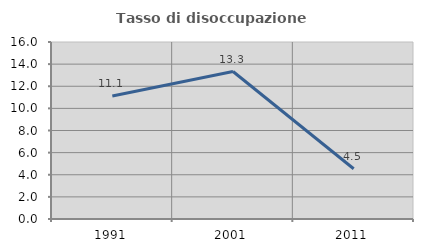
| Category | Tasso di disoccupazione giovanile  |
|---|---|
| 1991.0 | 11.111 |
| 2001.0 | 13.333 |
| 2011.0 | 4.545 |